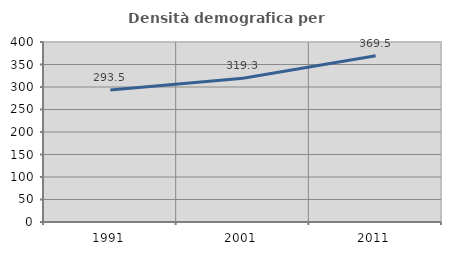
| Category | Densità demografica |
|---|---|
| 1991.0 | 293.519 |
| 2001.0 | 319.264 |
| 2011.0 | 369.53 |